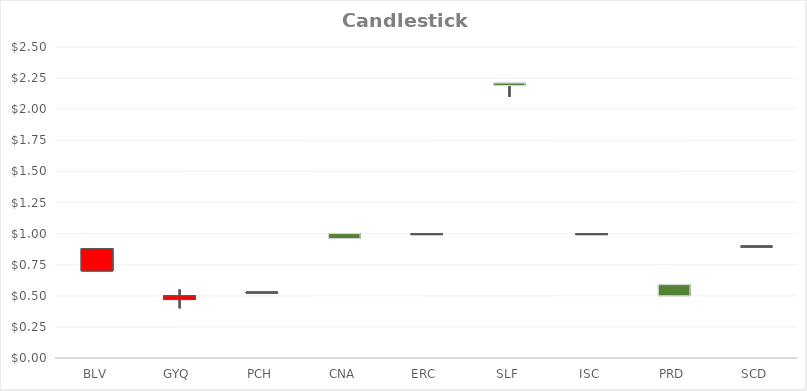
| Category | Open Feb 1 | High | Low | Close Feb 28 |
|---|---|---|---|---|
| BLV | 0.88 | 0.88 | 0.7 | 0.7 |
| GYQ | 0.5 | 0.55 | 0.4 | 0.47 |
| PCH | 0.53 | 0.53 | 0.53 | 0.53 |
| CNA | 0.96 | 1 | 0.96 | 1 |
| ERC | 1 | 1 | 1 | 1 |
| SLF | 2.19 | 2.21 | 2.1 | 2.21 |
| ISC | 1 | 1 | 1 | 1 |
| PRD | 0.5 | 0.59 | 0.5 | 0.59 |
| SCD | 0.9 | 0.9 | 0.9 | 0.9 |